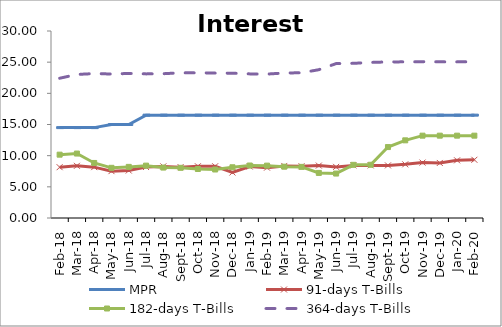
| Category | MPR | 91-days T-Bills | 182-days T-Bills | 364-days T-Bills |
|---|---|---|---|---|
| 2018-02-01 | 14.5 | 8.15 | 10.16 | 22.42 |
| 2018-03-01 | 14.5 | 8.37 | 10.34 | 23.03 |
| 2018-04-01 | 14.5 | 8.16 | 8.83 | 23.17 |
| 2018-05-01 | 15 | 7.52 | 8.05 | 23.1 |
| 2018-06-01 | 15 | 7.62 | 8.2 | 23.19 |
| 2018-07-01 | 16.5 | 8.18 | 8.4 | 23.12 |
| 2018-08-01 | 16.5 | 8.28 | 8.09 | 23.15 |
| 2018-09-01 | 16.5 | 8.16 | 8.05 | 23.29 |
| 2018-10-01 | 16.5 | 8.3 | 7.86 | 23.29 |
| 2018-11-01 | 16.5 | 8.3 | 7.78 | 23.25 |
| 2018-12-01 | 16.5 | 7.3 | 8.14 | 23.23 |
| 2019-01-01 | 16.5 | 8.26 | 8.42 | 23.12 |
| 2019-02-01 | 16.5 | 8.08 | 8.4 | 23.09 |
| 2019-03-01 | 16.5 | 8.35 | 8.23 | 23.26 |
| 2019-04-01 | 16.5 | 8.3 | 8.2 | 23.3 |
| 2019-05-01 | 16.5 | 8.41 | 7.23 | 23.79 |
| 2019-06-01 | 16.5 | 8.2 | 7.13 | 24.77 |
| 2019-07-01 | 16.5 | 8.44 | 8.53 | 24.81 |
| 2019-08-01 | 16.5 | 8.44 | 8.54 | 24.96 |
| 2019-09-01 | 16.5 | 8.44 | 11.38 | 25.04 |
| 2019-10-01 | 16.5 | 8.61 | 12.46 | 25.05 |
| 2019-11-01 | 16.5 | 8.89 | 13.21 | 25.07 |
| 2019-12-01 | 16.5 | 8.83 | 13.21 | 25.05 |
| 2020-01-01 | 16.5 | 9.25 | 13.21 | 25.05 |
| 2020-02-01 | 16.5 | 9.34 | 13.21 | 25.06 |